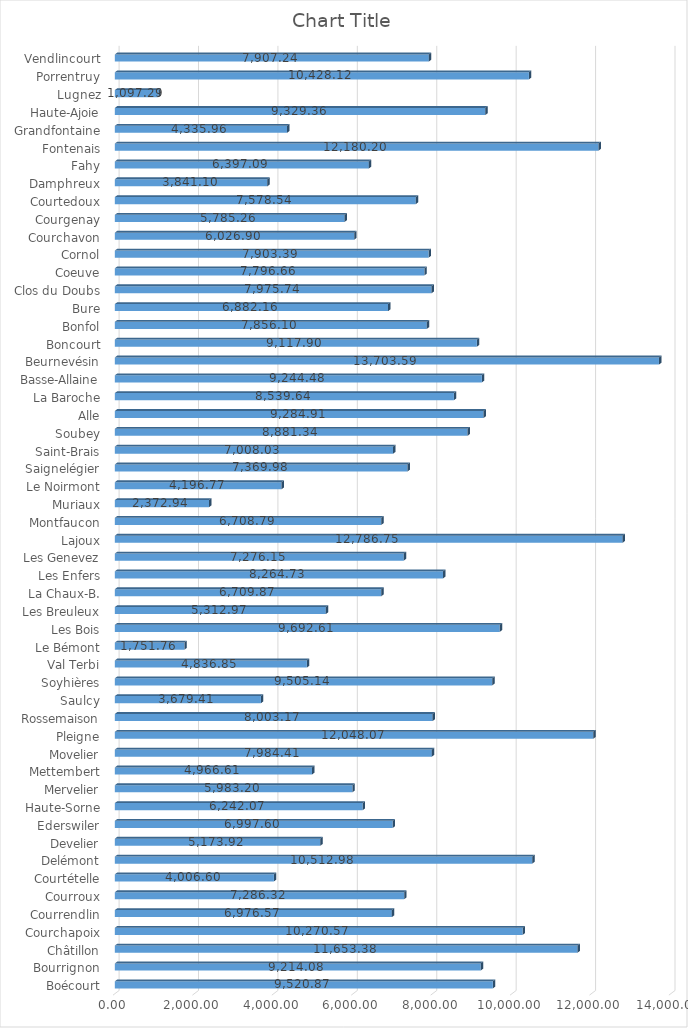
| Category | Series 0 |
|---|---|
| Boécourt | 9520.869 |
| Bourrignon | 9214.081 |
| Châtillon | 11653.382 |
| Courchapoix | 10270.569 |
| Courrendlin | 6976.571 |
| Courroux | 7286.322 |
| Courtételle | 4006.603 |
| Delémont | 10512.979 |
| Develier | 5173.921 |
| Ederswiler | 6997.601 |
| Haute-Sorne | 6242.071 |
| Mervelier | 5983.196 |
| Mettembert | 4966.613 |
| Movelier | 7984.411 |
| Pleigne | 12048.07 |
| Rossemaison | 8003.168 |
| Saulcy | 3679.407 |
| Soyhières | 9505.137 |
| Val Terbi | 4836.852 |
| Le Bémont | 1751.764 |
| Les Bois | 9692.608 |
| Les Breuleux | 5312.974 |
| La Chaux-B. | 6709.867 |
| Les Enfers | 8264.726 |
| Les Genevez | 7276.15 |
| Lajoux | 12786.75 |
| Montfaucon | 6708.792 |
| Muriaux | 2372.942 |
| Le Noirmont | 4196.769 |
| Saignelégier | 7369.98 |
| Saint-Brais | 7008.027 |
| Soubey | 8881.344 |
| Alle | 9284.91 |
| La Baroche | 8539.639 |
| Basse-Allaine | 9244.481 |
| Beurnevésin | 13703.588 |
| Boncourt | 9117.899 |
| Bonfol | 7856.098 |
| Bure | 6882.16 |
| Clos du Doubs | 7975.74 |
| Coeuve | 7796.662 |
| Cornol | 7903.395 |
| Courchavon | 6026.902 |
| Courgenay | 5785.256 |
| Courtedoux | 7578.541 |
| Damphreux | 3841.101 |
| Fahy | 6397.088 |
| Fontenais | 12180.196 |
| Grandfontaine | 4335.961 |
| Haute-Ajoie | 9329.361 |
| Lugnez | 1097.285 |
| Porrentruy | 10428.116 |
| Vendlincourt | 7907.244 |